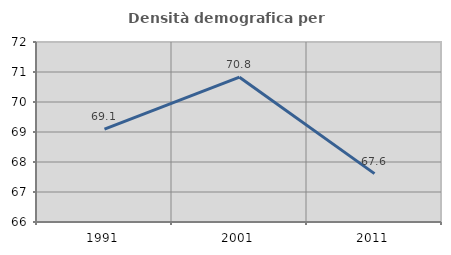
| Category | Densità demografica |
|---|---|
| 1991.0 | 69.096 |
| 2001.0 | 70.826 |
| 2011.0 | 67.613 |